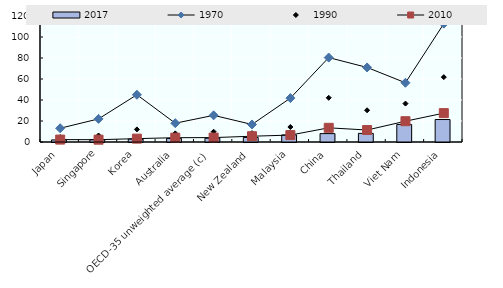
| Category | 2017 |
|---|---|
| Japan | 2 |
| Singapore | 2.2 |
| Korea | 2.8 |
| Australia | 3.3 |
| OECD-35 unweighted average (c) | 3.6 |
| New Zealand | 4.3 |
| Malaysia | 6.7 |
| China | 8 |
| Thailand | 8.2 |
| Viet Nam | 16.7 |
| Indonesia | 21.4 |